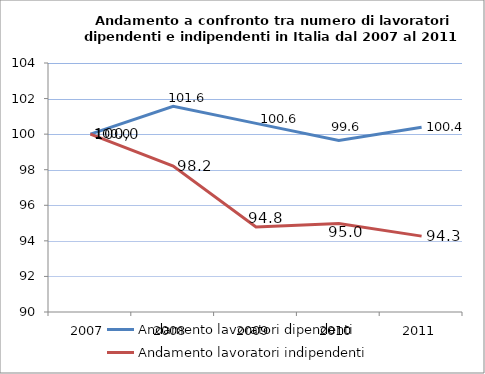
| Category | Andamento lavoratori dipendenti | Andamento lavoratori indipendenti |
|---|---|---|
| 2007 | 100 | 100 |
| 2008 | 101.565 | 98.202 |
| 2009 | 100.607 | 94.781 |
| 2010 | 99.644 | 94.974 |
| 2011 | 100.386 | 94.266 |